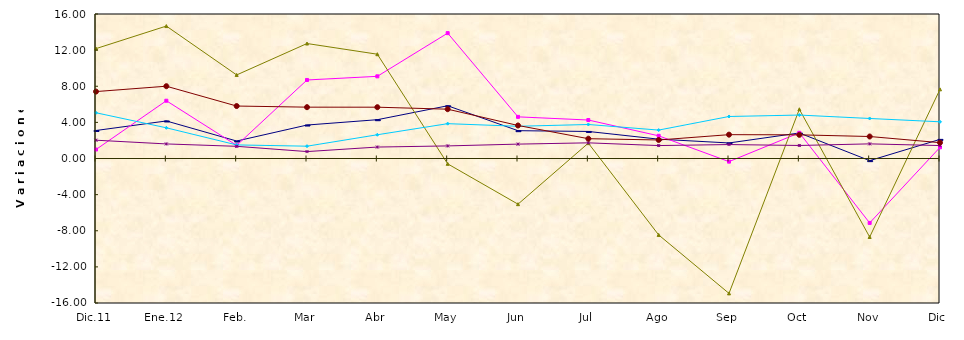
| Category | Series 0 | Series 1 | Series 2 | Series 3 | Series 4 | Series 5 |
|---|---|---|---|---|---|---|
| Dic.11 | 3.101 | 0.994 | 12.166 | 5.063 | 2.025 | 7.41 |
| Ene.12 | 4.157 | 6.397 | 14.663 | 3.398 | 1.613 | 8.004 |
| Feb. | 1.935 | 1.452 | 9.252 | 1.505 | 1.349 | 5.809 |
| Mar | 3.706 | 8.694 | 12.731 | 1.362 | 0.765 | 5.684 |
| Abr | 4.298 | 9.098 | 11.547 | 2.63 | 1.268 | 5.68 |
| May | 5.838 | 13.882 | -0.591 | 3.857 | 1.394 | 5.46 |
| Jun | 3.08 | 4.612 | -5.057 | 3.569 | 1.593 | 3.656 |
| Jul | 2.993 | 4.26 | 1.701 | 3.765 | 1.735 | 2.192 |
| Ago | 2.141 | 2.511 | -8.463 | 3.145 | 1.432 | 2.051 |
| Sep | 1.721 | -0.347 | -14.935 | 4.652 | 1.545 | 2.64 |
| Oct | 2.826 | 2.844 | 5.449 | 4.81 | 1.443 | 2.62 |
| Nov | -0.236 | -7.135 | -8.693 | 4.431 | 1.62 | 2.435 |
| Dic | 2.117 | 1.236 | 7.656 | 4.063 | 1.434 | 1.754 |